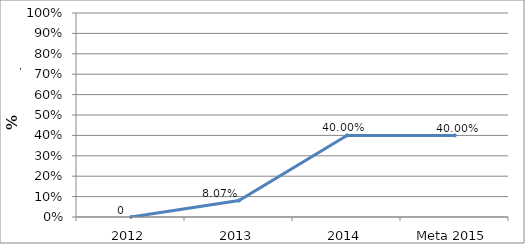
| Category | CONSTRUCCIÓN |
|---|---|
| 2012 | 0 |
| 2013 | 0.081 |
| 2014 | 0.4 |
| Meta 2015 | 0.4 |